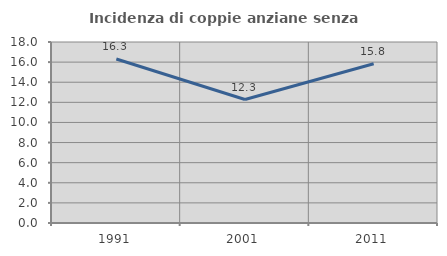
| Category | Incidenza di coppie anziane senza figli  |
|---|---|
| 1991.0 | 16.312 |
| 2001.0 | 12.281 |
| 2011.0 | 15.842 |